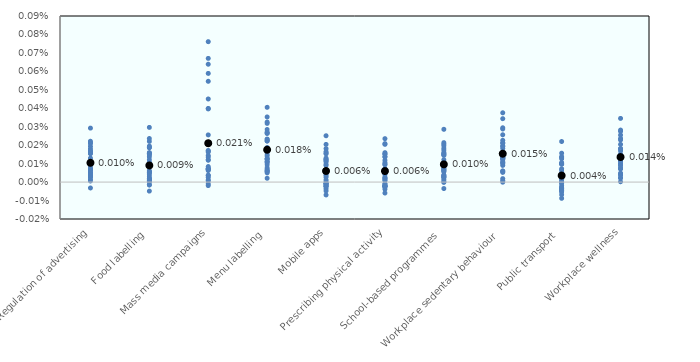
| Category | AUS | AUT | BEL | BGR | CAN | CHE | CYP | CZE | DEU | DNK | ESP | EST | FIN | FRA | GBR | GRC | HRV | HUN | IRL | ISL | ITA | JPN | LTU | LUX | LVA | MEX | MLT | NLD | NOR | POL | PRT | ROU | SVK | SVN | SWE | ZAF | Average |
|---|---|---|---|---|---|---|---|---|---|---|---|---|---|---|---|---|---|---|---|---|---|---|---|---|---|---|---|---|---|---|---|---|---|---|---|---|---|
| Regulation of advertising | 0 | 0 | 0 |  | 0 | 0 |  | 0 | 0 | 0 | 0 | 0 | 0 | 0 | 0 | 0 |  | 0 | 0 | 0 | 0 | 0 | 0 | 0 | 0 |  |  | 0 | 0 | 0 | 0 |  | 0 | 0 | 0 | 0 | 0 |
| Food labelling | 0 | 0 | 0 |  | 0 | 0 |  | 0 | 0 | 0 | 0 | 0 | 0 | 0 | 0 | 0 |  | 0 | 0 | 0 | 0 | 0 | 0 | 0 | 0 |  |  | 0 | 0 | 0 | 0 |  | 0 | 0 | 0 | 0 | 0 |
| Mass media campaigns | 0 | 0 | 0 |  | 0 | 0 |  | 0.001 | 0 | 0 | 0 | 0.001 | 0 | 0 | 0 | 0 |  | 0.001 | 0 | 0 | 0 | 0 | 0 | 0 | 0.001 |  |  | 0 | 0 | 0 | 0 |  | 0.001 | 0 | 0 | 0 | 0 |
| Menu labelling | 0 | 0 | 0 |  | 0 | 0 |  | 0 | 0 | 0 | 0 | 0 | 0 | 0 | 0 | 0 |  | 0 | 0 | 0 | 0 | 0 | 0 | 0 | 0 |  |  | 0 | 0 | 0 | 0 |  | 0 | 0 | 0 | 0 | 0 |
| Mobile apps | 0 | 0 | 0 |  | 0 | 0 |  | 0 | 0 | 0 | 0 | 0 | 0 | 0 | 0 | 0 |  | 0 | 0 | 0 | 0 | 0 | 0 | 0 | 0 |  |  | 0 | 0 | 0 | 0 |  | 0 | 0 | 0 | 0 | 0 |
| Prescribing physical activity | 0 | 0 | 0 |  | 0 | 0 |  | 0 | 0 | 0 | 0 | 0 | 0 | 0 | 0 | 0 |  | 0 | 0 | 0 | 0 | 0 | 0 | 0 | 0 |  |  | 0 | 0 | 0 | 0 |  | 0 | 0 | 0 | 0 | 0 |
| School-based programmes | 0 | 0 | 0 |  | 0 | 0 |  | 0 | 0 | 0 | 0 | 0 | 0 | 0 | 0 | 0 |  | 0 | 0 | 0 | 0 | 0 | 0 | 0 | 0 |  |  | 0 | 0 | 0 | 0 |  | 0 | 0 | 0 | 0 | 0 |
| Workplace sedentary behaviour | 0 | 0 | 0 |  | 0 | 0 |  | 0 | 0 | 0 | 0 | 0 | 0 | 0 | 0 | 0 |  | 0 | 0 | 0 | 0 | 0 | 0 | 0 | 0 |  |  | 0 | 0 | 0 | 0 |  | 0 | 0 | 0 | 0 | 0 |
| Public transport | 0 | 0 | 0 |  | 0 | 0 |  | 0 | 0 | 0 | 0 | 0 | 0 | 0 | 0 | 0 |  | 0 | 0 | 0 | 0 | 0 | 0 | 0 | 0 |  |  | 0 | 0 | 0 | 0 |  | 0 | 0 | 0 | 0 | 0 |
| Workplace wellness | 0 | 0 | 0 |  | 0 | 0 |  | 0 | 0 | 0 | 0 | 0 | 0 | 0 | 0 | 0 |  | 0 | 0 | 0 | 0 | 0 | 0 | 0 | 0 |  |  | 0 | 0 | 0 | 0 |  | 0 | 0 | 0 | 0 | 0 |